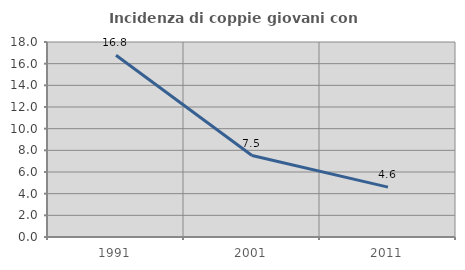
| Category | Incidenza di coppie giovani con figli |
|---|---|
| 1991.0 | 16.783 |
| 2001.0 | 7.516 |
| 2011.0 | 4.605 |